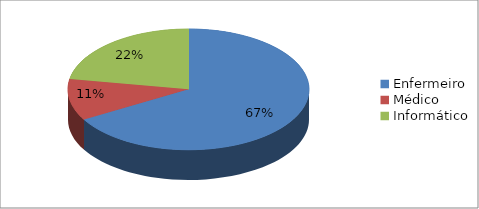
| Category | Series 0 |
|---|---|
| Enfermeiro | 6 |
| Médico | 1 |
| Informático | 2 |